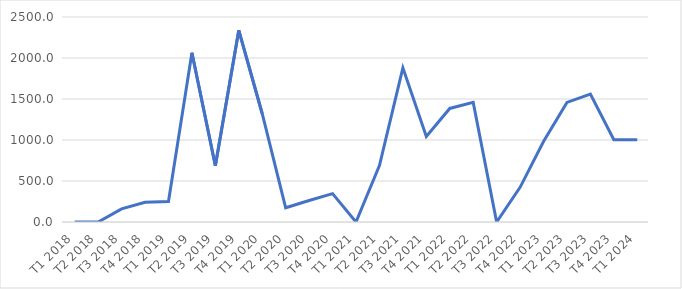
| Category | Series 0 |
|---|---|
| T1 2018 | 0 |
| T2 2018 | 0 |
| T3 2018 | 159.672 |
| T4 2018 | 240.328 |
| T1 2019 | 250.583 |
| T2 2019 | 2063.206 |
| T3 2019 | 685.894 |
| T4 2019 | 2337.025 |
| T1 2020 | 1320.151 |
| T2 2020 | 173.466 |
| T3 2020 | 261.53 |
| T4 2020 | 345.565 |
| T1 2021 | 0 |
| T2 2021 | 688.191 |
| T3 2021 | 1880.154 |
| T4 2021 | 1043.364 |
| T1 2022 | 1384.99 |
| T2 2022 | 1458.924 |
| T3 2022 | 0 |
| T4 2022 | 422.834 |
| T1 2023 | 980.739 |
| T2 2023 | 1458.924 |
| T3 2023 | 1560.87 |
| T4 2023 | 1002.52 |
| T1 2024 | 1003.52 |